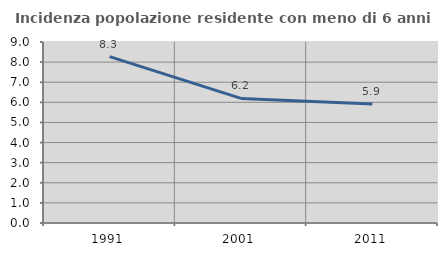
| Category | Incidenza popolazione residente con meno di 6 anni |
|---|---|
| 1991.0 | 8.273 |
| 2001.0 | 6.197 |
| 2011.0 | 5.915 |